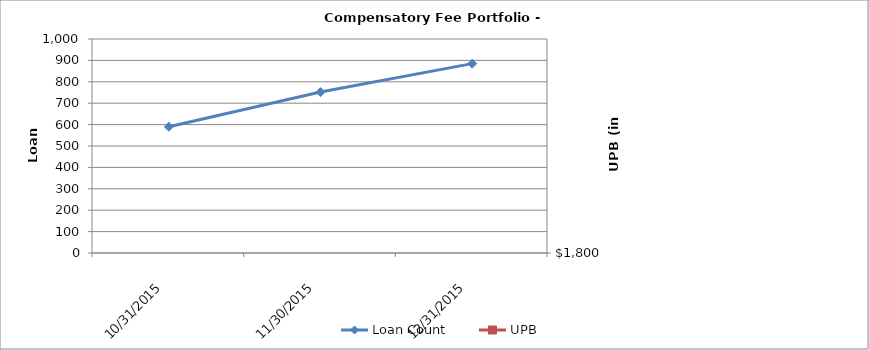
| Category | Loan Count |
|---|---|
| 10/31/15 | 590 |
| 11/30/15 | 752 |
| 12/31/15 | 885 |